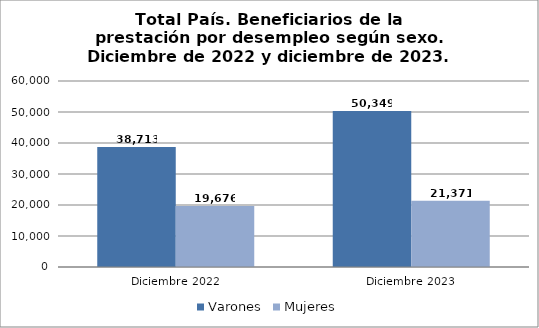
| Category | Varones | Mujeres |
|---|---|---|
| Diciembre 2022 | 38713 | 19676 |
| Diciembre 2023 | 50349 | 21371 |